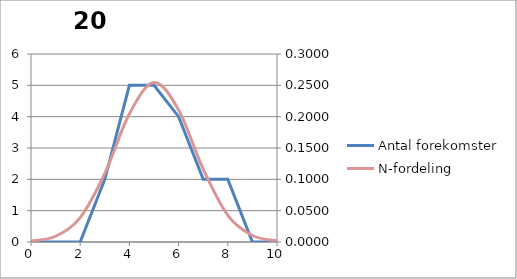
| Category | Antal forekomster |
|---|---|
| 0.0 | 0 |
| 1.0 | 0 |
| 2.0 | 0 |
| 3.0 | 2 |
| 4.0 | 5 |
| 5.0 | 5 |
| 6.0 | 4 |
| 7.0 | 2 |
| 8.0 | 2 |
| 9.0 | 0 |
| 10.0 | 0 |